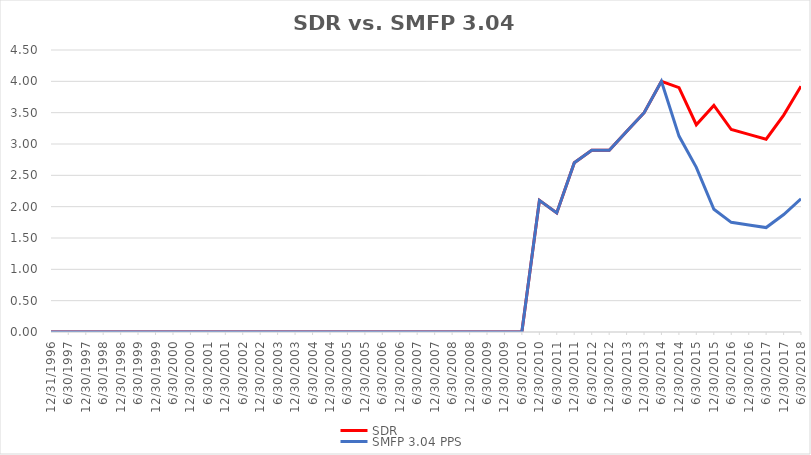
| Category | SDR | SMFP 3.04 PPS |
|---|---|---|
| 12/31/96 | 0 | 0 |
| 6/30/97 | 0 | 0 |
| 12/31/97 | 0 | 0 |
| 6/30/98 | 0 | 0 |
| 12/31/98 | 0 | 0 |
| 6/30/99 | 0 | 0 |
| 12/31/99 | 0 | 0 |
| 6/30/00 | 0 | 0 |
| 12/31/00 | 0 | 0 |
| 6/30/01 | 0 | 0 |
| 12/31/01 | 0 | 0 |
| 6/30/02 | 0 | 0 |
| 12/31/02 | 0 | 0 |
| 6/30/03 | 0 | 0 |
| 12/31/03 | 0 | 0 |
| 6/30/04 | 0 | 0 |
| 12/31/04 | 0 | 0 |
| 6/30/05 | 0 | 0 |
| 12/31/05 | 0 | 0 |
| 6/30/06 | 0 | 0 |
| 12/31/06 | 0 | 0 |
| 6/30/07 | 0 | 0 |
| 12/31/07 | 0 | 0 |
| 6/30/08 | 0 | 0 |
| 12/31/08 | 0 | 0 |
| 6/30/09 | 0 | 0 |
| 12/31/09 | 0 | 0 |
| 6/30/10 | 0 | 0 |
| 12/31/10 | 2.1 | 2.1 |
| 6/30/11 | 1.9 | 1.9 |
| 12/31/11 | 2.7 | 2.7 |
| 6/30/12 | 2.9 | 2.9 |
| 12/31/12 | 2.9 | 2.9 |
| 6/30/13 | 3.2 | 3.2 |
| 12/31/13 | 3.5 | 3.5 |
| 6/30/14 | 4 | 4 |
| 12/31/14 | 3.9 | 3.126 |
| 6/30/15 | 3.308 | 2.627 |
| 12/31/15 | 3.615 | 1.958 |
| 6/30/16 | 3.231 | 1.75 |
| 12/31/16 | 3.154 | 1.708 |
| 6/30/17 | 3.077 | 1.667 |
| 12/31/17 | 3.462 | 1.875 |
| 6/30/18 | 3.923 | 2.125 |